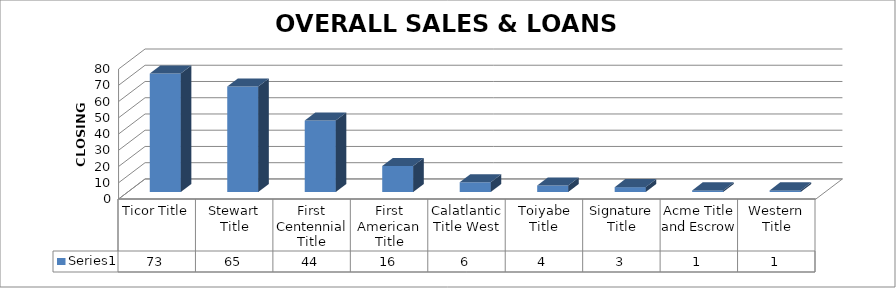
| Category | Series 0 |
|---|---|
| Ticor Title | 73 |
| Stewart Title | 65 |
| First Centennial Title | 44 |
| First American Title | 16 |
| Calatlantic Title West | 6 |
| Toiyabe Title | 4 |
| Signature Title | 3 |
| Acme Title and Escrow | 1 |
| Western Title | 1 |